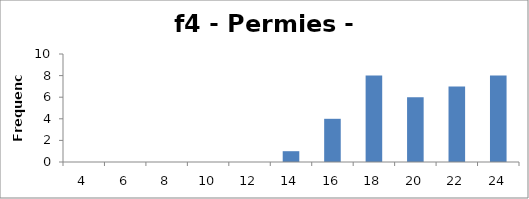
| Category | Frequency |
|---|---|
| 4.0 | 0 |
| 6.0 | 0 |
| 8.0 | 0 |
| 10.0 | 0 |
| 12.0 | 0 |
| 14.0 | 1 |
| 16.0 | 4 |
| 18.0 | 8 |
| 20.0 | 6 |
| 22.0 | 7 |
| 24.0 | 8 |